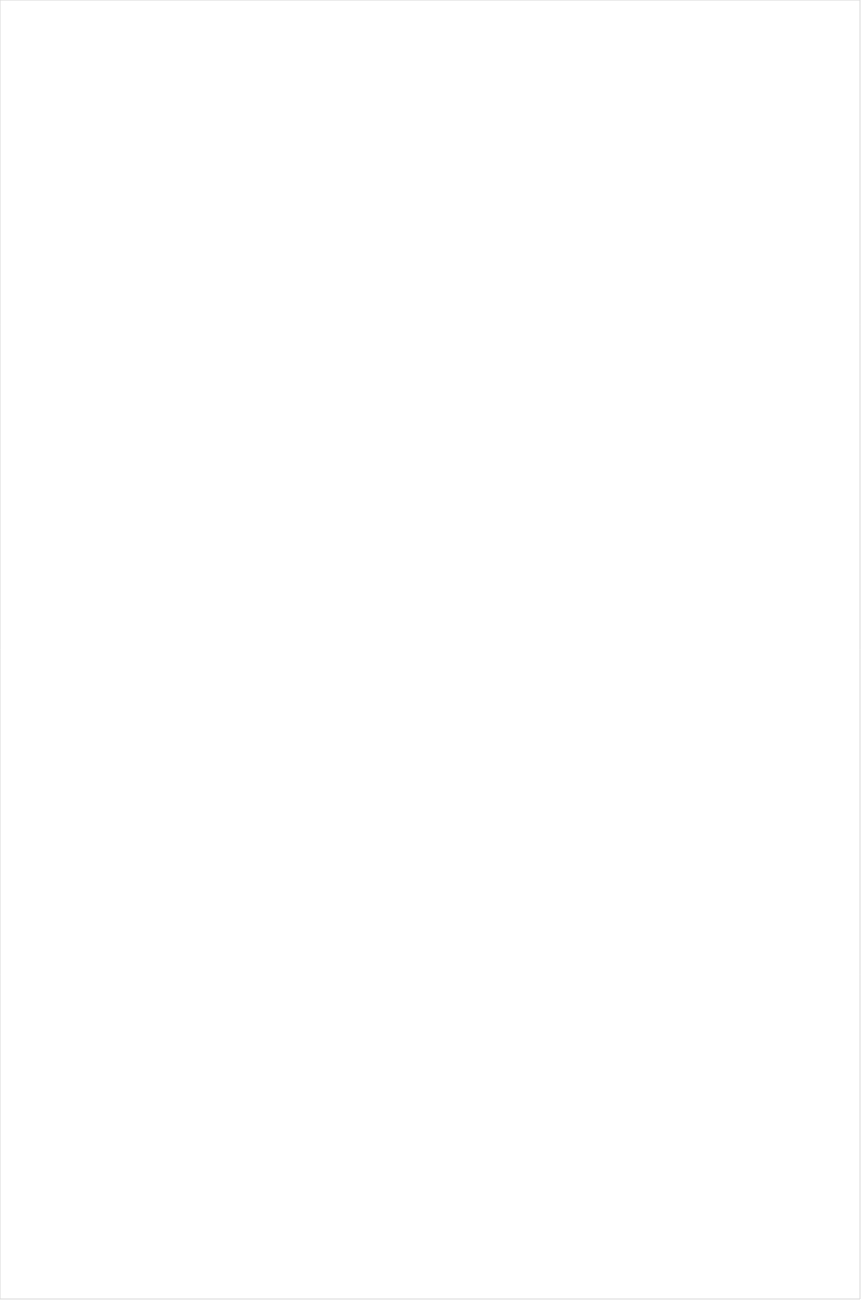
| Category | Total |
|---|---|
| Cartoon Network | -0.581 |
| BET | -0.553 |
| VH1 | -0.488 |
| TV ONE | -0.472 |
| Lifetime Movies | -0.466 |
| BET Her | -0.419 |
| MTV2 | -0.388 |
| Oprah Winfrey Network | -0.386 |
| Logo | -0.329 |
| UniMas | -0.326 |
| Nick Toons | -0.325 |
| Disney Channel | -0.313 |
| MyNetworkTV | -0.312 |
| TLC | -0.286 |
| WE TV | -0.269 |
| Univision | -0.242 |
| Teen Nick | -0.24 |
| Nick | -0.238 |
| Telemundo | -0.228 |
| Adult Swim | -0.223 |
| Lifetime | -0.211 |
| Nick Jr. | -0.183 |
| Hallmark | -0.182 |
| NBC Universo | -0.181 |
| Hallmark Movies & Mysteries | -0.162 |
| Travel | -0.158 |
| Disney XD | -0.156 |
| Investigation Discovery | -0.153 |
| CMTV | -0.152 |
| UP TV | -0.148 |
| Discovery Life Channel | -0.141 |
| ION | -0.127 |
| CW | -0.114 |
| BRAVO | -0.112 |
| Disney Junior US | -0.086 |
| Headline News | -0.081 |
| Galavision | -0.063 |
| Universal Kids | -0.042 |
| OXYGEN | -0.034 |
| Nick@Nite | -0.029 |
| SYFY | -0.024 |
| POP | -0.02 |
| E! | -0.018 |
| TUDN | -0.011 |
| FOX | 0.002 |
| Discovery Family Channel | 0.018 |
| Freeform | 0.029 |
| Great American Country | 0.029 |
| MTV | 0.044 |
| CBS | 0.049 |
| NBC | 0.05 |
| Science Channel | 0.05 |
| Discovery Channel | 0.05 |
| A&E | 0.054 |
| HGTV | 0.056 |
| ABC | 0.062 |
| PBS | 0.076 |
| FXX | 0.085 |
| Motor Trend Network | 0.086 |
| FX Movie Channel | 0.086 |
| Animal Planet | 0.105 |
| MSNBC | 0.116 |
| History Channel | 0.118 |
| INSP | 0.121 |
| National Geographic Wild | 0.148 |
| FX | 0.157 |
| USA Network | 0.174 |
| Ovation | 0.206 |
| Food Network | 0.235 |
| WGN America | 0.237 |
| TBS | 0.258 |
| Paramount Network | 0.258 |
| BBC America | 0.265 |
| TV LAND | 0.27 |
| CNN | 0.274 |
| Destination America | 0.278 |
| TNT | 0.279 |
| National Geographic | 0.292 |
| Weather Channel | 0.295 |
| Reelz Channel | 0.298 |
| SundanceTV | 0.302 |
| DIY | 0.303 |
| Fox Business | 0.308 |
| FYI | 0.311 |
| Comedy Central | 0.33 |
| AMC | 0.341 |
| truTV | 0.345 |
| Fox News | 0.356 |
| RFD TV | 0.393 |
| CNBC | 0.417 |
| Game Show | 0.418 |
| Viceland | 0.437 |
| Bloomberg HD | 0.447 |
| Cooking Channel | 0.454 |
| American Heroes Channel | 0.455 |
| Independent Film (IFC) | 0.497 |
| Smithsonian | 0.501 |
| The Sportsman Channel | 0.594 |
| Outdoor Channel | 0.63 |
| FXDEP | 0.782 |
| ESPN Deportes | 0.87 |
| NBC Sports | 1.009 |
| Tennis Channel | 1.168 |
| FOX Sports 2 | 1.18 |
| CBS Sports | 1.391 |
| NBA TV | 1.509 |
| ESPN2 | 1.565 |
| ESPN | 1.641 |
| NFL Network | 1.688 |
| ESPNEWS | 1.693 |
| Fox Sports 1 | 1.713 |
| PAC-12 Network | 1.745 |
| Golf | 1.886 |
| Olympic Channel | 1.89 |
| Big Ten Network | 2.044 |
| NHL | 3.06 |
| ESPNU | 3.579 |
| MLB Network | 5.039 |